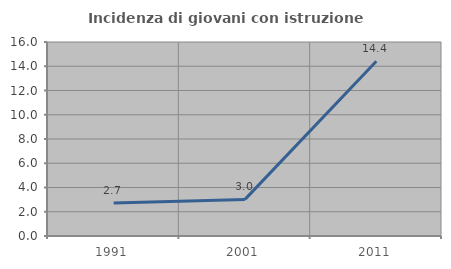
| Category | Incidenza di giovani con istruzione universitaria |
|---|---|
| 1991.0 | 2.73 |
| 2001.0 | 3.019 |
| 2011.0 | 14.407 |